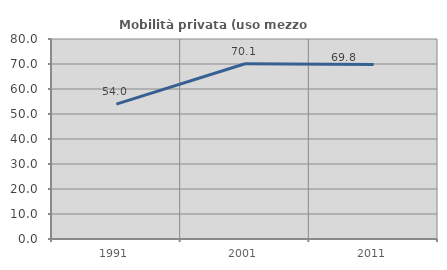
| Category | Mobilità privata (uso mezzo privato) |
|---|---|
| 1991.0 | 53.971 |
| 2001.0 | 70.087 |
| 2011.0 | 69.782 |